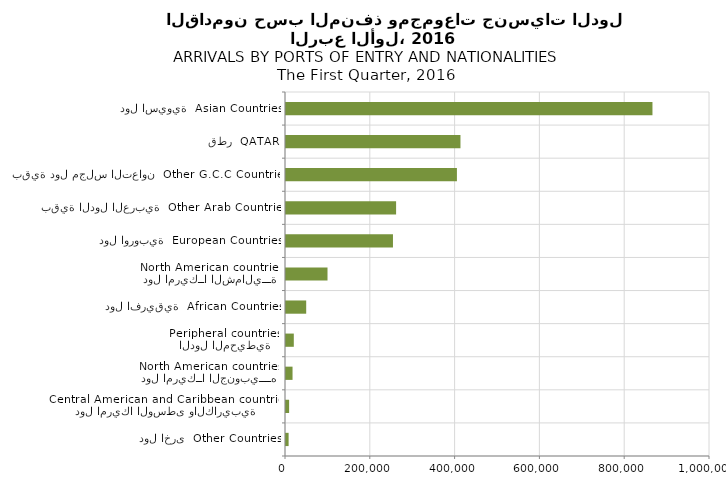
| Category | Series 0 |
|---|---|
| دول اخرى  Other Countries | 6156 |
| دول امريكا الوسطى والكاريبية
Central American and Caribbean countries | 7344 |
| دول امريكــا الجنوبيــــه
North American countries | 15412 |
| الدول المحيطية
Peripheral countries | 18402 |
| دول افريقية  African Countries | 47633 |
| دول امريكــا الشماليـــة
North American countries | 97897 |
| دول اوروبية  European Countries | 252281 |
| بقية الدول العربية  Other Arab Countries | 259659 |
| بقية دول مجلس التعاون  Other G.C.C Countries | 403114 |
| قطر  QATAR | 411471 |
| دول اسيوية  Asian Countries | 864286 |